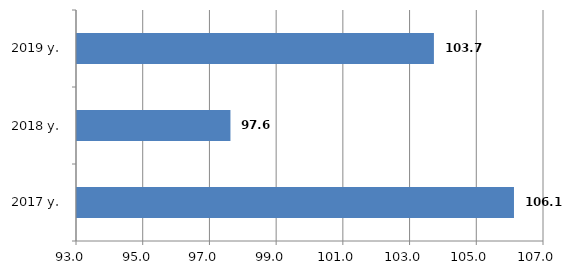
| Category | Series 0 |
|---|---|
| 2017 y. | 106.1 |
| 2018 y. | 97.6 |
| 2019 y. | 103.7 |